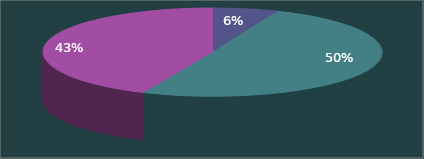
| Category | Series 0 |
|---|---|
| 0 | 0.33 |
| 1 | 2.709 |
| 2 | 2.33 |